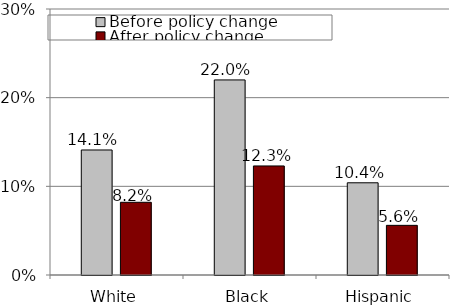
| Category | Before policy change | After policy change |
|---|---|---|
| White | 0.141 | 0.082 |
| Black | 0.22 | 0.123 |
| Hispanic | 0.104 | 0.056 |